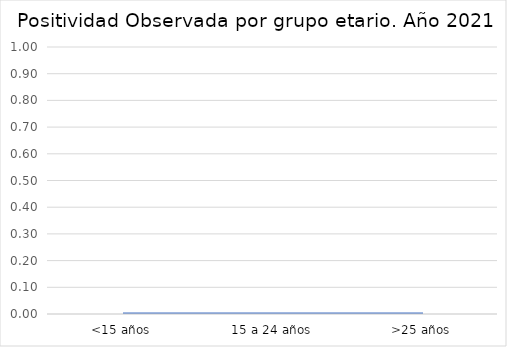
| Category | Positividad |
|---|---|
| <15 años | 0 |
| 15 a 24 años | 0 |
| >25 años | 0 |